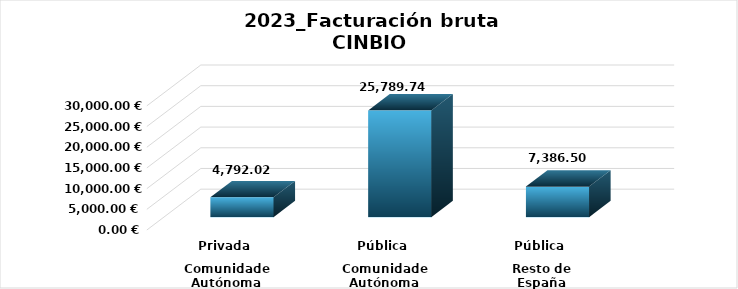
| Category | Series 0 |
|---|---|
| 0 | 4792.025 |
| 1 | 25789.735 |
| 2 | 7386.502 |